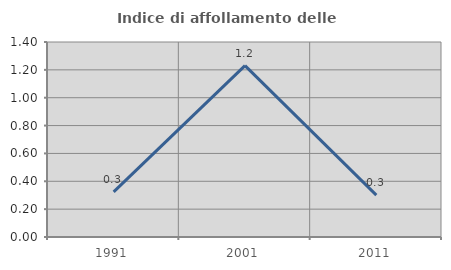
| Category | Indice di affollamento delle abitazioni  |
|---|---|
| 1991.0 | 0.324 |
| 2001.0 | 1.23 |
| 2011.0 | 0.301 |